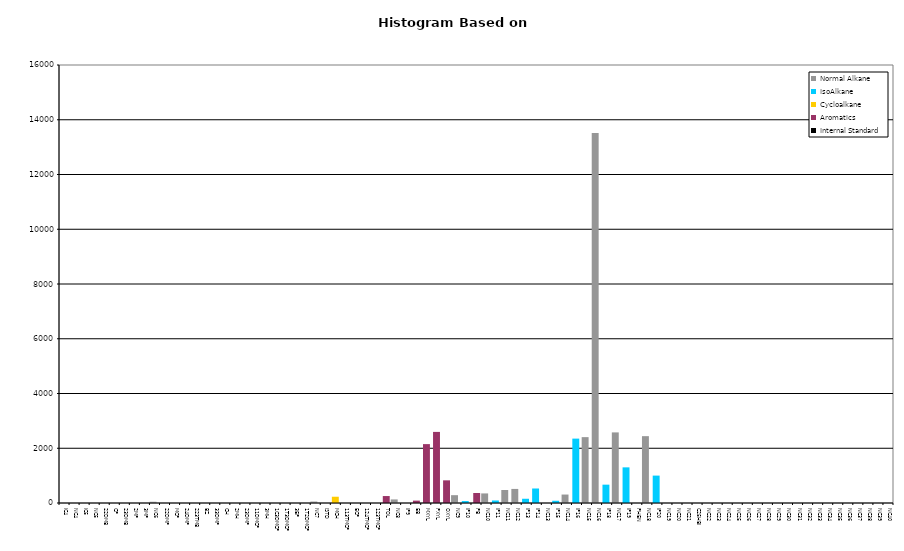
| Category | Normal Alkane | IsoAlkane | Cycloalkane | Aromatics | Internal Standard |
|---|---|---|---|---|---|
| IC4 | 0 | 0 | 0 | 0 | 0 |
| NC4 | 0 | 0 | 0 | 0 | 0 |
| IC5 | 0 | 0 | 0 | 0 | 0 |
| NC5 | 0 | 0 | 0 | 0 | 0 |
| 22DMB | 0 | 0 | 0 | 0 | 0 |
| CP | 0 | 0 | 0 | 0 | 0 |
| 23DMB | 0 | 0 | 0 | 0 | 0 |
| 2MP | 0 | 0 | 0 | 0 | 0 |
| 3MP | 0 | 0 | 0 | 0 | 0 |
| NC6 | 45 | 0 | 0 | 0 | 0 |
| 22DMP | 0 | 0 | 0 | 0 | 0 |
| MCP | 0 | 0 | 0 | 0 | 0 |
| 24DMP | 0 | 0 | 0 | 0 | 0 |
| 223TMB | 0 | 0 | 0 | 0 | 0 |
| BZ | 0 | 0 | 0 | 0 | 0 |
| 33DMP | 0 | 0 | 0 | 0 | 0 |
| CH | 0 | 0 | 0 | 0 | 0 |
| 2MH | 0 | 0 | 0 | 0 | 0 |
| 23DMP | 0 | 0 | 0 | 0 | 0 |
| 11DMCP | 0 | 0 | 0 | 0 | 0 |
| 3MH | 0 | 0 | 0 | 0 | 0 |
| 1C3DMCP | 0 | 0 | 0 | 0 | 0 |
| 1T3DMCP | 0 | 0 | 0 | 0 | 0 |
| 3EP | 0 | 0 | 0 | 0 | 0 |
| 1T2DMCP | 0 | 0 | 0 | 0 | 0 |
| NC7 | 53 | 0 | 0 | 0 | 0 |
| ISTD | 0 | 0 | 0 | 0 | 0 |
| MCH | 0 | 0 | 229 | 0 | 0 |
| 113TMCP | 0 | 0 | 0 | 0 | 0 |
| ECP | 0 | 0 | 0 | 0 | 0 |
| 124TMCP | 0 | 0 | 0 | 0 | 0 |
| 123TMCP | 0 | 0 | 0 | 0 | 0 |
| TOL | 0 | 0 | 0 | 254 | 0 |
| NC8 | 130 | 0 | 0 | 0 | 0 |
| IP9 | 0 | 0 | 0 | 0 | 0 |
| EB | 0 | 0 | 0 | 87 | 0 |
| MXYL | 0 | 0 | 0 | 2151 | 0 |
| PXYL | 0 | 0 | 0 | 2597 | 0 |
| OXYL | 0 | 0 | 0 | 828 | 0 |
| NC9 | 286 | 0 | 0 | 0 | 0 |
| IP10 | 0 | 71 | 0 | 0 | 0 |
| PB | 0 | 0 | 0 | 366 | 0 |
| NC10 | 350 | 0 | 0 | 0 | 0 |
| IP11 | 0 | 92 | 0 | 0 | 0 |
| NC11 | 476 | 0 | 0 | 0 | 0 |
| NC12 | 514 | 0 | 0 | 0 | 0 |
| IP13 | 0 | 155 | 0 | 0 | 0 |
| IP14 | 0 | 530 | 0 | 0 | 0 |
| NC13 | 0 | 0 | 0 | 0 | 0 |
| IP15 | 0 | 82 | 0 | 0 | 0 |
| NC14 | 309 | 0 | 0 | 0 | 0 |
| IP16 | 0 | 2352 | 0 | 0 | 0 |
| NC15 | 2406 | 0 | 0 | 0 | 0 |
| NC16 | 13517 | 0 | 0 | 0 | 0 |
| IP18 | 0 | 670 | 0 | 0 | 0 |
| NC17 | 2579 | 0 | 0 | 0 | 0 |
| IP19 | 0 | 1302 | 0 | 0 | 0 |
| PHEN | 0 | 0 | 0 | 0 | 0 |
| NC18 | 2442 | 0 | 0 | 0 | 0 |
| IP20 | 0 | 1001 | 0 | 0 | 0 |
| NC19 | 0 | 0 | 0 | 0 | 0 |
| NC20 | 0 | 0 | 0 | 0 | 0 |
| NC21 | 0 | 0 | 0 | 0 | 0 |
| C25HBI | 0 | 0 | 0 | 0 | 0 |
| NC22 | 0 | 0 | 0 | 0 | 0 |
| NC23 | 0 | 0 | 0 | 0 | 0 |
| NC24 | 0 | 0 | 0 | 0 | 0 |
| NC25 | 0 | 0 | 0 | 0 | 0 |
| NC26 | 0 | 0 | 0 | 0 | 0 |
| NC27 | 0 | 0 | 0 | 0 | 0 |
| NC28 | 0 | 0 | 0 | 0 | 0 |
| NC29 | 0 | 0 | 0 | 0 | 0 |
| NC30 | 0 | 0 | 0 | 0 | 0 |
| NC31 | 0 | 0 | 0 | 0 | 0 |
| NC32 | 0 | 0 | 0 | 0 | 0 |
| NC33 | 0 | 0 | 0 | 0 | 0 |
| NC34 | 0 | 0 | 0 | 0 | 0 |
| NC35 | 0 | 0 | 0 | 0 | 0 |
| NC36 | 0 | 0 | 0 | 0 | 0 |
| NC37 | 0 | 0 | 0 | 0 | 0 |
| NC38 | 0 | 0 | 0 | 0 | 0 |
| NC39 | 0 | 0 | 0 | 0 | 0 |
| NC40 | 0 | 0 | 0 | 0 | 0 |